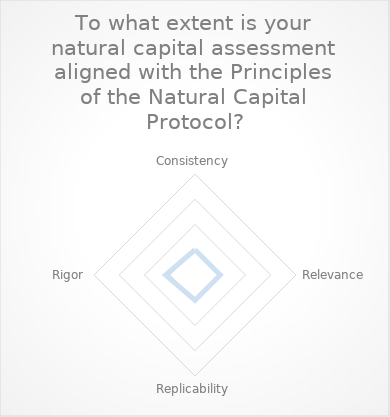
| Category | Series 0 |
|---|---|
| Consistency | 1 |
| Relevance | 1 |
| Replicability | 1 |
| Rigor | 1.167 |